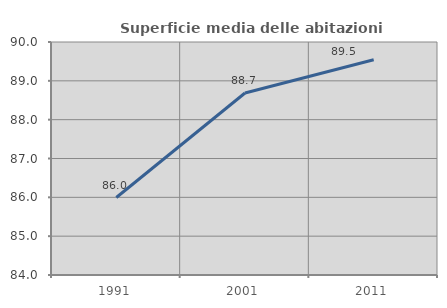
| Category | Superficie media delle abitazioni occupate |
|---|---|
| 1991.0 | 85.995 |
| 2001.0 | 88.687 |
| 2011.0 | 89.542 |